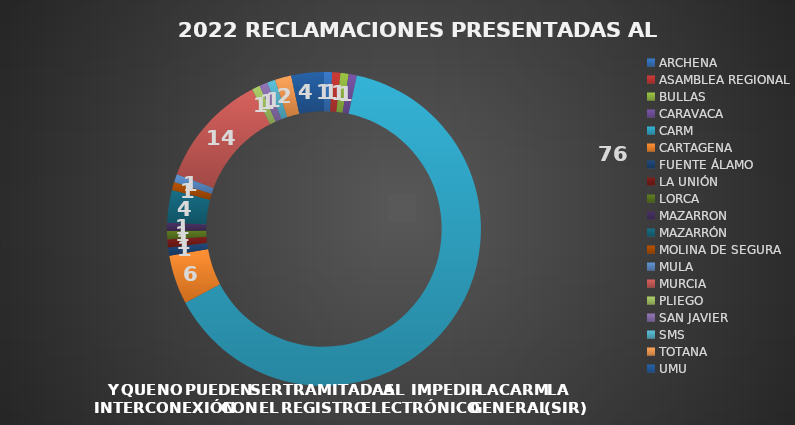
| Category | Total |
|---|---|
| ARCHENA | 1 |
| ASAMBLEA REGIONAL | 1 |
| BULLAS | 1 |
| CARAVACA | 1 |
| CARM | 76 |
| CARTAGENA | 6 |
| FUENTE ÁLAMO | 1 |
| LA UNIÓN | 1 |
| LORCA | 1 |
| MAZARRON | 1 |
| MAZARRÓN | 4 |
| MOLINA DE SEGURA | 1 |
| MULA | 1 |
| MURCIA | 14 |
| PLIEGO | 1 |
| SAN JAVIER | 1 |
| SMS | 1 |
| TOTANA | 2 |
| UMU | 4 |